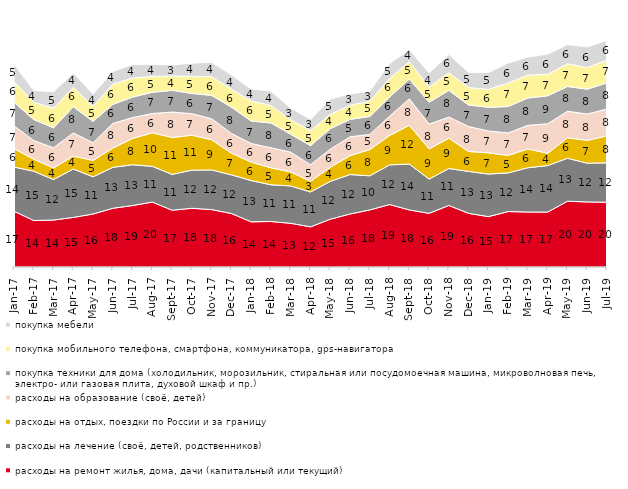
| Category | расходы на ремонт жилья, дома, дачи (капитальный или текущий) | расходы на лечение (своё, детей, родственников) | расходы на отдых, поездки по России и за границу | расходы на образование (своё, детей) | покупка техники для дома (холодильник, морозильник, стиральная или посудомоечная машина, микроволновая печь, электро- или газовая плита, духовой шкаф и пр.) | покупка мобильного телефона, смартфона, коммуникатора, gps-навигатора | покупка мебели |
|---|---|---|---|---|---|---|---|
| 2017-01-01 | 17.1 | 13.55 | 5.65 | 7 | 7.2 | 6.35 | 5.3 |
| 2017-02-01 | 14.25 | 15.1 | 3.7 | 5.7 | 6.45 | 5.3 | 3.6 |
| 2017-03-01 | 14.4 | 12.4 | 3.55 | 6.2 | 6.1 | 6 | 5.05 |
| 2017-04-01 | 15.2 | 14.85 | 3.95 | 7.1 | 8.05 | 5.95 | 4.35 |
| 2017-05-01 | 16.25 | 11.4 | 5 | 5.45 | 6.55 | 4.6 | 3.75 |
| 2017-06-01 | 18 | 12.55 | 5.9 | 7.55 | 5.85 | 6.2 | 3.85 |
| 2017-07-01 | 18.85 | 12.5 | 8.05 | 6.4 | 6.3 | 5.85 | 4.15 |
| 2017-08-01 | 19.9 | 10.95 | 10.3 | 5.9 | 6.5 | 4.85 | 3.7 |
| 2017-09-01 | 17.4 | 11 | 11.3 | 7.8 | 6.65 | 4.4 | 3.4 |
| 2017-10-01 | 18 | 11.7 | 10.7 | 6.6 | 6.2 | 5.25 | 4 |
| 2017-11-01 | 17.6 | 12.15 | 9.25 | 6.45 | 7.15 | 5.75 | 4.4 |
| 2017-12-01 | 16.4 | 11.85 | 6.65 | 6.05 | 8.05 | 5.5 | 4.35 |
| 2018-01-01 | 13.85 | 12.65 | 5.65 | 5.7 | 6.9 | 6.15 | 3.65 |
| 2018-02-01 | 13.95 | 11.25 | 5.2 | 6.15 | 7.6 | 5.35 | 4.4 |
| 2018-03-01 | 13.4 | 11.45 | 4.3 | 6.05 | 5.5 | 4.5 | 3.45 |
| 2018-04-01 | 12.3 | 10.7 | 3.25 | 5.1 | 5.85 | 4.6 | 3.45 |
| 2018-05-01 | 14.65 | 11.6 | 4.3 | 5.55 | 6.3 | 4.4 | 4.65 |
| 2018-06-01 | 16.25 | 12.1 | 5.8 | 5.75 | 5.35 | 4.35 | 3.45 |
| 2018-07-01 | 17.5 | 10.45 | 8.05 | 4.65 | 5.5 | 4.65 | 3.1 |
| 2018-08-01 | 19.15 | 12.15 | 9 | 5.9 | 5.9 | 5.65 | 4.6 |
| 2018-09-01 | 17.5 | 14.05 | 11.9 | 8.1 | 6.05 | 5.4 | 3.6 |
| 2018-10-01 | 16.45 | 10.5 | 9.25 | 7.6 | 6.7 | 4.65 | 4.3 |
| 2018-11-01 | 18.862 | 11.327 | 9.281 | 6.487 | 8.184 | 5.389 | 5.589 |
| 2018-12-01 | 16.45 | 12.85 | 6.1 | 7.65 | 6.6 | 5.35 | 4.65 |
| 2019-01-01 | 15.45 | 13.05 | 6.5 | 6.7 | 7.25 | 5.5 | 5.15 |
| 2019-02-01 | 17 | 11.85 | 5.35 | 6.9 | 8.1 | 7.2 | 6.1 |
| 2019-03-01 | 16.857 | 13.575 | 5.768 | 7.21 | 8.404 | 7.011 | 5.52 |
| 2019-04-01 | 16.832 | 14.257 | 3.762 | 9.059 | 8.564 | 6.584 | 6.238 |
| 2019-05-01 | 20.158 | 13.175 | 6.29 | 8.123 | 7.578 | 6.984 | 5.844 |
| 2019-06-01 | 19.95 | 11.87 | 6.983 | 8.08 | 7.631 | 6.633 | 6.284 |
| 2019-07-01 | 19.851 | 12.079 | 8.267 | 8.218 | 8.02 | 6.98 | 6.04 |